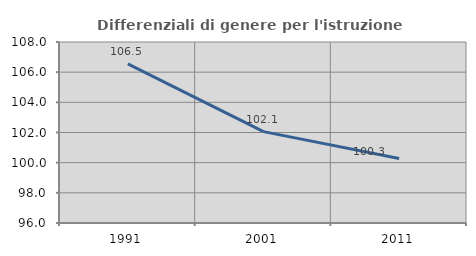
| Category | Differenziali di genere per l'istruzione superiore |
|---|---|
| 1991.0 | 106.549 |
| 2001.0 | 102.059 |
| 2011.0 | 100.282 |